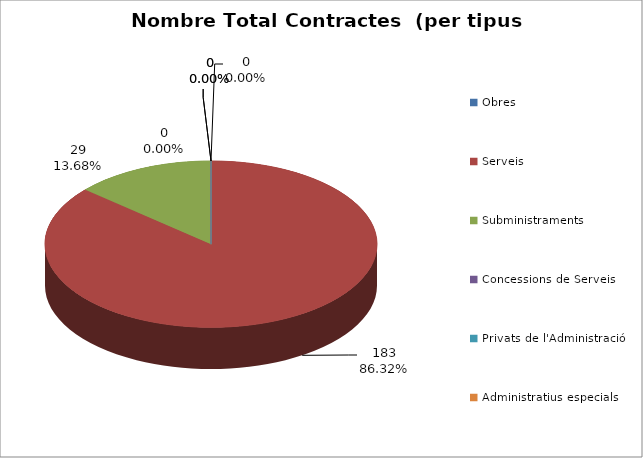
| Category | Nombre Total Contractes |
|---|---|
| Obres | 0 |
| Serveis | 183 |
| Subministraments | 29 |
| Concessions de Serveis | 0 |
| Privats de l'Administració | 0 |
| Administratius especials | 0 |